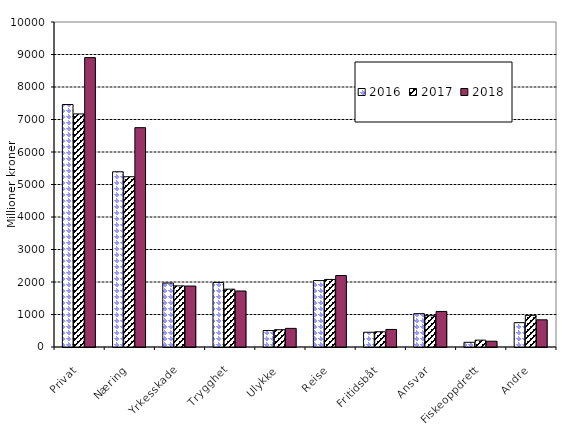
| Category | 2016 | 2017 | 2018 |
|---|---|---|---|
| Privat | 7461.039 | 7171.79 | 8904.142 |
| Næring | 5391.97 | 5239.137 | 6748.784 |
| Yrkesskade | 1966.977 | 1881.452 | 1876.31 |
| Trygghet | 1986.795 | 1779.099 | 1723.776 |
| Ulykke | 507.423 | 531.976 | 573.454 |
| Reise | 2043.508 | 2078.892 | 2198.929 |
| Fritidsbåt | 453.982 | 468.766 | 540.133 |
| Ansvar | 1026.439 | 963.648 | 1093.978 |
| Fiskeoppdrett | 144.281 | 211.046 | 178.362 |
| Andre | 749.461 | 973.926 | 836.575 |